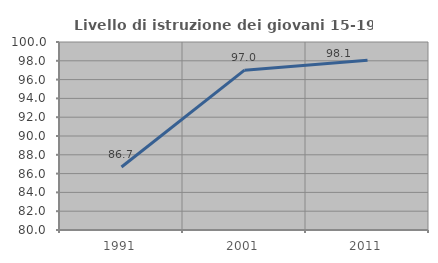
| Category | Livello di istruzione dei giovani 15-19 anni |
|---|---|
| 1991.0 | 86.702 |
| 2001.0 | 97.003 |
| 2011.0 | 98.066 |